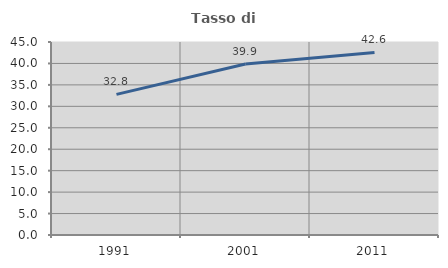
| Category | Tasso di occupazione   |
|---|---|
| 1991.0 | 32.796 |
| 2001.0 | 39.886 |
| 2011.0 | 42.56 |